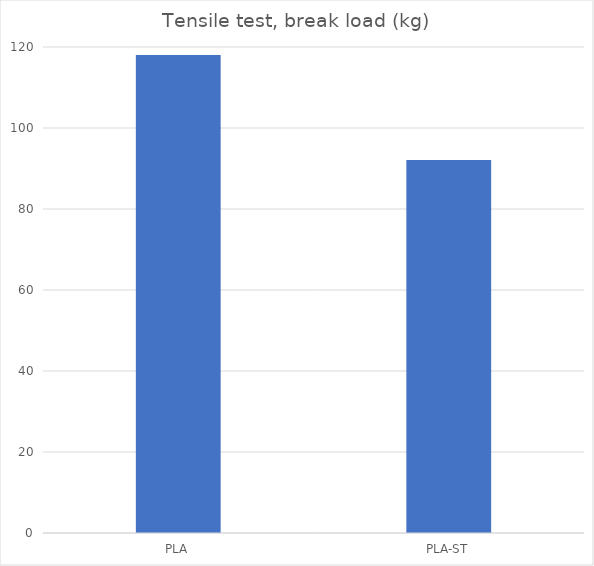
| Category | Average (kg) |
|---|---|
| PLA | 118 |
| PLA-ST | 92.1 |